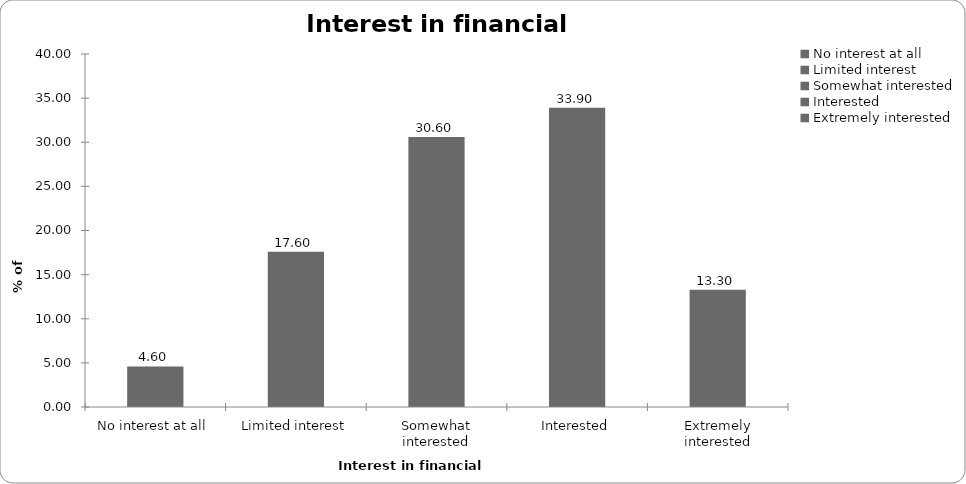
| Category | Interest in financial planning |
|---|---|
| No interest at all | 4.6 |
| Limited interest | 17.6 |
| Somewhat interested | 30.6 |
| Interested | 33.9 |
| Extremely interested | 13.3 |